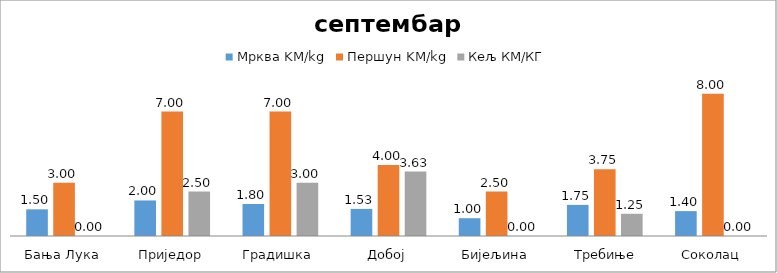
| Category | Мрква KM/kg | Першун KM/kg | Кељ КМ/КГ |
|---|---|---|---|
| Бања Лука | 1.5 | 3 | 0 |
| Приједор | 2 | 7 | 2.5 |
| Градишка | 1.8 | 7 | 3 |
| Добој | 1.525 | 4 | 3.625 |
| Бијељина | 1 | 2.5 | 0 |
|  Требиње | 1.75 | 3.75 | 1.25 |
| Соколац | 1.4 | 8 | 0 |